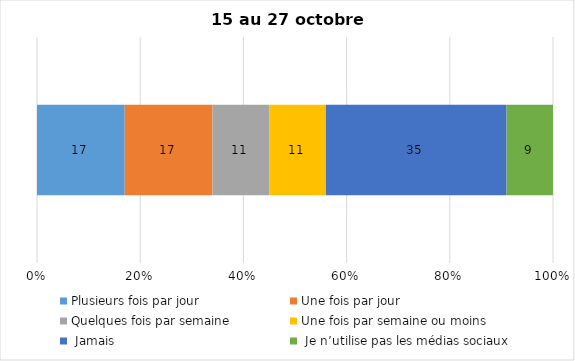
| Category | Plusieurs fois par jour | Une fois par jour | Quelques fois par semaine   | Une fois par semaine ou moins   |  Jamais   |  Je n’utilise pas les médias sociaux |
|---|---|---|---|---|---|---|
| 0 | 17 | 17 | 11 | 11 | 35 | 9 |